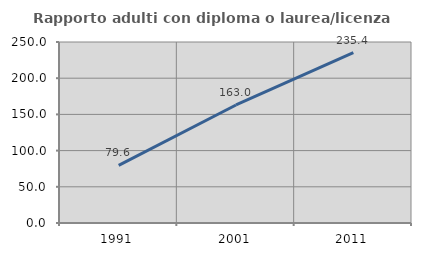
| Category | Rapporto adulti con diploma o laurea/licenza media  |
|---|---|
| 1991.0 | 79.624 |
| 2001.0 | 163.019 |
| 2011.0 | 235.433 |